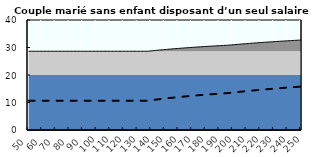
| Category | Coin fiscal moyen (somme des composantes) | Taux moyen d'imposition net en % du salaire brut |
|---|---|---|
| 50.0 | 28.633 | 10.67 |
| 51.0 | 28.633 | 10.67 |
| 52.0 | 28.633 | 10.67 |
| 53.0 | 28.633 | 10.67 |
| 54.0 | 28.633 | 10.67 |
| 55.0 | 28.633 | 10.67 |
| 56.0 | 28.633 | 10.67 |
| 57.0 | 28.633 | 10.67 |
| 58.0 | 28.633 | 10.67 |
| 59.0 | 28.633 | 10.67 |
| 60.0 | 28.633 | 10.67 |
| 61.0 | 28.633 | 10.67 |
| 62.0 | 28.633 | 10.67 |
| 63.0 | 28.633 | 10.67 |
| 64.0 | 28.633 | 10.67 |
| 65.0 | 28.633 | 10.67 |
| 66.0 | 28.633 | 10.67 |
| 67.0 | 28.633 | 10.67 |
| 68.0 | 28.633 | 10.67 |
| 69.0 | 28.633 | 10.67 |
| 70.0 | 28.633 | 10.67 |
| 71.0 | 28.633 | 10.67 |
| 72.0 | 28.633 | 10.67 |
| 73.0 | 28.633 | 10.67 |
| 74.0 | 28.633 | 10.67 |
| 75.0 | 28.633 | 10.67 |
| 76.0 | 28.633 | 10.67 |
| 77.0 | 28.633 | 10.67 |
| 78.0 | 28.633 | 10.67 |
| 79.0 | 28.633 | 10.67 |
| 80.0 | 28.633 | 10.67 |
| 81.0 | 28.633 | 10.67 |
| 82.0 | 28.633 | 10.67 |
| 83.0 | 28.633 | 10.67 |
| 84.0 | 28.633 | 10.67 |
| 85.0 | 28.633 | 10.67 |
| 86.0 | 28.633 | 10.67 |
| 87.0 | 28.633 | 10.67 |
| 88.0 | 28.633 | 10.67 |
| 89.0 | 28.633 | 10.67 |
| 90.0 | 28.633 | 10.67 |
| 91.0 | 28.633 | 10.67 |
| 92.0 | 28.633 | 10.67 |
| 93.0 | 28.633 | 10.67 |
| 94.0 | 28.633 | 10.67 |
| 95.0 | 28.633 | 10.67 |
| 96.0 | 28.633 | 10.67 |
| 97.0 | 28.633 | 10.67 |
| 98.0 | 28.633 | 10.67 |
| 99.0 | 28.633 | 10.67 |
| 100.0 | 28.633 | 10.67 |
| 101.0 | 28.633 | 10.67 |
| 102.0 | 28.633 | 10.67 |
| 103.0 | 28.633 | 10.67 |
| 104.0 | 28.633 | 10.67 |
| 105.0 | 28.633 | 10.67 |
| 106.0 | 28.633 | 10.67 |
| 107.0 | 28.633 | 10.67 |
| 108.0 | 28.633 | 10.67 |
| 109.0 | 28.633 | 10.67 |
| 110.0 | 28.633 | 10.67 |
| 111.0 | 28.633 | 10.67 |
| 112.0 | 28.633 | 10.67 |
| 113.0 | 28.633 | 10.67 |
| 114.0 | 28.633 | 10.67 |
| 115.0 | 28.633 | 10.67 |
| 116.0 | 28.633 | 10.67 |
| 117.0 | 28.633 | 10.67 |
| 118.0 | 28.633 | 10.67 |
| 119.0 | 28.633 | 10.67 |
| 120.0 | 28.633 | 10.67 |
| 121.0 | 28.633 | 10.67 |
| 122.0 | 28.633 | 10.67 |
| 123.0 | 28.633 | 10.67 |
| 124.0 | 28.633 | 10.67 |
| 125.0 | 28.633 | 10.67 |
| 126.0 | 28.633 | 10.67 |
| 127.0 | 28.633 | 10.67 |
| 128.0 | 28.633 | 10.67 |
| 129.0 | 28.633 | 10.67 |
| 130.0 | 28.633 | 10.67 |
| 131.0 | 28.633 | 10.67 |
| 132.0 | 28.633 | 10.67 |
| 133.0 | 28.633 | 10.67 |
| 134.0 | 28.633 | 10.67 |
| 135.0 | 28.633 | 10.67 |
| 136.0 | 28.633 | 10.67 |
| 137.0 | 28.633 | 10.67 |
| 138.0 | 28.671 | 10.718 |
| 139.0 | 28.724 | 10.784 |
| 140.0 | 28.776 | 10.848 |
| 141.0 | 28.827 | 10.912 |
| 142.0 | 28.877 | 10.975 |
| 143.0 | 28.926 | 11.037 |
| 144.0 | 28.975 | 11.098 |
| 145.0 | 29.023 | 11.159 |
| 146.0 | 29.071 | 11.218 |
| 147.0 | 29.118 | 11.277 |
| 148.0 | 29.164 | 11.335 |
| 149.0 | 29.21 | 11.392 |
| 150.0 | 29.255 | 11.448 |
| 151.0 | 29.299 | 11.504 |
| 152.0 | 29.343 | 11.559 |
| 153.0 | 29.386 | 11.613 |
| 154.0 | 29.429 | 11.666 |
| 155.0 | 29.471 | 11.719 |
| 156.0 | 29.513 | 11.771 |
| 157.0 | 29.554 | 11.823 |
| 158.0 | 29.595 | 11.874 |
| 159.0 | 29.635 | 11.924 |
| 160.0 | 29.674 | 11.973 |
| 161.0 | 29.713 | 12.022 |
| 162.0 | 29.752 | 12.071 |
| 163.0 | 29.79 | 12.118 |
| 164.0 | 29.828 | 12.165 |
| 165.0 | 29.865 | 12.212 |
| 166.0 | 29.902 | 12.258 |
| 167.0 | 29.938 | 12.303 |
| 168.0 | 29.974 | 12.348 |
| 169.0 | 30.009 | 12.393 |
| 170.0 | 30.044 | 12.437 |
| 171.0 | 30.079 | 12.48 |
| 172.0 | 30.113 | 12.523 |
| 173.0 | 30.147 | 12.565 |
| 174.0 | 30.18 | 12.607 |
| 175.0 | 30.214 | 12.648 |
| 176.0 | 30.246 | 12.689 |
| 177.0 | 30.279 | 12.73 |
| 178.0 | 30.31 | 12.77 |
| 179.0 | 30.342 | 12.809 |
| 180.0 | 30.373 | 12.848 |
| 181.0 | 30.404 | 12.887 |
| 182.0 | 30.435 | 12.925 |
| 183.0 | 30.465 | 12.963 |
| 184.0 | 30.495 | 13 |
| 185.0 | 30.524 | 13.037 |
| 186.0 | 30.554 | 13.074 |
| 187.0 | 30.583 | 13.11 |
| 188.0 | 30.611 | 13.146 |
| 189.0 | 30.64 | 13.182 |
| 190.0 | 30.668 | 13.217 |
| 191.0 | 30.695 | 13.251 |
| 192.0 | 30.723 | 13.286 |
| 193.0 | 30.75 | 13.32 |
| 194.0 | 30.777 | 13.353 |
| 195.0 | 30.803 | 13.387 |
| 196.0 | 30.83 | 13.42 |
| 197.0 | 30.867 | 13.466 |
| 198.0 | 30.911 | 13.522 |
| 199.0 | 30.955 | 13.577 |
| 200.0 | 30.999 | 13.631 |
| 201.0 | 31.042 | 13.685 |
| 202.0 | 31.084 | 13.738 |
| 203.0 | 31.126 | 13.791 |
| 204.0 | 31.168 | 13.843 |
| 205.0 | 31.209 | 13.894 |
| 206.0 | 31.25 | 13.946 |
| 207.0 | 31.29 | 13.996 |
| 208.0 | 31.331 | 14.047 |
| 209.0 | 31.37 | 14.096 |
| 210.0 | 31.41 | 14.145 |
| 211.0 | 31.449 | 14.194 |
| 212.0 | 31.487 | 14.243 |
| 213.0 | 31.525 | 14.29 |
| 214.0 | 31.563 | 14.338 |
| 215.0 | 31.601 | 14.385 |
| 216.0 | 31.638 | 14.431 |
| 217.0 | 31.675 | 14.477 |
| 218.0 | 31.711 | 14.523 |
| 219.0 | 31.748 | 14.568 |
| 220.0 | 31.783 | 14.613 |
| 221.0 | 31.819 | 14.658 |
| 222.0 | 31.854 | 14.702 |
| 223.0 | 31.889 | 14.745 |
| 224.0 | 31.924 | 14.789 |
| 225.0 | 31.958 | 14.832 |
| 226.0 | 31.992 | 14.874 |
| 227.0 | 32.025 | 14.916 |
| 228.0 | 32.059 | 14.958 |
| 229.0 | 32.092 | 14.999 |
| 230.0 | 32.125 | 15.04 |
| 231.0 | 32.157 | 15.081 |
| 232.0 | 32.189 | 15.121 |
| 233.0 | 32.221 | 15.161 |
| 234.0 | 32.253 | 15.201 |
| 235.0 | 32.284 | 15.24 |
| 236.0 | 32.315 | 15.279 |
| 237.0 | 32.346 | 15.318 |
| 238.0 | 32.377 | 15.356 |
| 239.0 | 32.407 | 15.394 |
| 240.0 | 32.437 | 15.432 |
| 241.0 | 32.467 | 15.469 |
| 242.0 | 32.497 | 15.506 |
| 243.0 | 32.526 | 15.543 |
| 244.0 | 32.555 | 15.58 |
| 245.0 | 32.584 | 15.616 |
| 246.0 | 32.613 | 15.652 |
| 247.0 | 32.641 | 15.687 |
| 248.0 | 32.67 | 15.722 |
| 249.0 | 32.697 | 15.757 |
| 250.0 | 32.725 | 15.792 |